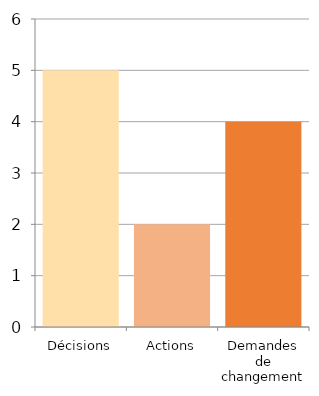
| Category | Series 0 |
|---|---|
| Décisions | 5 |
| Actions | 2 |
| Demandes de changement  | 4 |